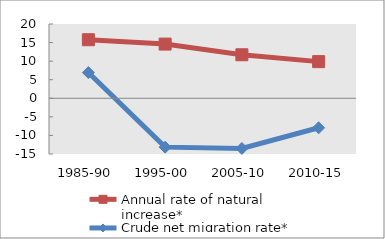
| Category | Annual rate of natural increase* | Crude net migration rate* |
|---|---|---|
| 1985-90 | 15.764 | 6.924 |
| 1995-00 | 14.592 | -13.152 |
| 2005-10 | 11.717 | -13.505 |
| 2010-15 | 9.868 | -7.942 |